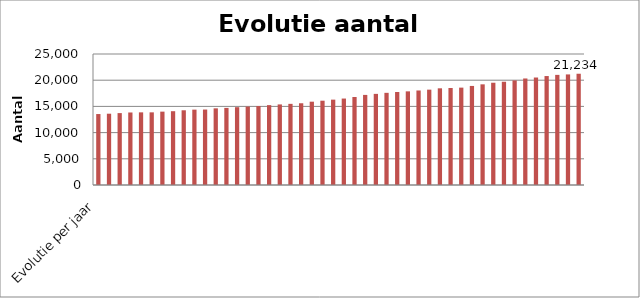
| Category | Inwoners |
|---|---|
| Evolutie per jaar | 13541 |